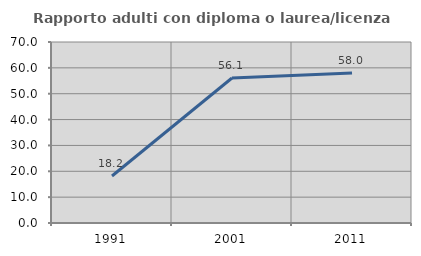
| Category | Rapporto adulti con diploma o laurea/licenza media  |
|---|---|
| 1991.0 | 18.182 |
| 2001.0 | 56.085 |
| 2011.0 | 58.039 |